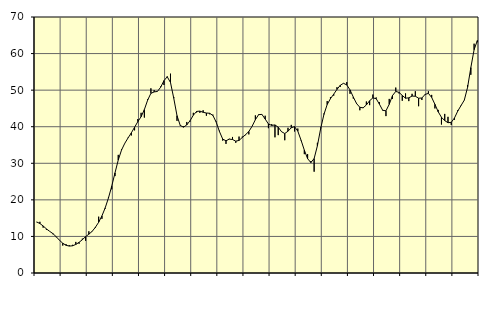
| Category | Piggar | Series 1 |
|---|---|---|
| nan | 13.9 | 13.96 |
| 87.0 | 14 | 13.53 |
| 87.0 | 12.4 | 12.86 |
| 87.0 | 11.8 | 12.06 |
| nan | 11.4 | 11.39 |
| 88.0 | 10.6 | 10.76 |
| 88.0 | 9.8 | 9.91 |
| 88.0 | 9 | 8.95 |
| nan | 7.5 | 8.14 |
| 89.0 | 7.9 | 7.58 |
| 89.0 | 7.6 | 7.36 |
| 89.0 | 7.7 | 7.44 |
| nan | 8.5 | 7.81 |
| 90.0 | 8 | 8.39 |
| 90.0 | 9.4 | 9.1 |
| 90.0 | 8.8 | 9.94 |
| nan | 11.4 | 10.61 |
| 91.0 | 11.3 | 11.38 |
| 91.0 | 12.3 | 12.5 |
| 91.0 | 15.4 | 13.87 |
| nan | 14.8 | 15.62 |
| 92.0 | 17.6 | 17.81 |
| 92.0 | 20.7 | 20.52 |
| 92.0 | 22.9 | 23.73 |
| nan | 26.5 | 27.37 |
| 93.0 | 32.3 | 30.9 |
| 93.0 | 33.8 | 33.6 |
| 93.0 | 35.5 | 35.46 |
| nan | 37 | 36.92 |
| 94.0 | 37.6 | 38.31 |
| 94.0 | 39 | 39.85 |
| 94.0 | 42.1 | 41.38 |
| nan | 43.8 | 42.73 |
| 95.0 | 42.5 | 44.69 |
| 95.0 | 47.5 | 47.26 |
| 95.0 | 50.5 | 49.13 |
| nan | 50 | 49.51 |
| 96.0 | 49.7 | 49.65 |
| 96.0 | 51 | 50.81 |
| 96.0 | 51.4 | 52.59 |
| nan | 53.8 | 53.65 |
| 97.0 | 54.5 | 52.09 |
| 97.0 | 48.1 | 47.79 |
| 97.0 | 41.6 | 43.02 |
| nan | 40.2 | 40.33 |
| 98.0 | 40.1 | 39.88 |
| 98.0 | 41.3 | 40.5 |
| 98.0 | 41.4 | 41.65 |
| nan | 43.8 | 43.15 |
| 99.0 | 43.9 | 44.18 |
| 99.0 | 43.8 | 44.27 |
| 99.0 | 44.5 | 43.94 |
| nan | 43 | 43.75 |
| 0.0 | 43.4 | 43.67 |
| 0.0 | 43.3 | 43.07 |
| 0.0 | 41.4 | 41.26 |
| nan | 38.9 | 38.68 |
| 1.0 | 36.2 | 36.61 |
| 1.0 | 35.3 | 36.15 |
| 1.0 | 36.7 | 36.61 |
| nan | 37.2 | 36.5 |
| 2.0 | 35.6 | 36.05 |
| 2.0 | 37.3 | 36.25 |
| 2.0 | 37.3 | 37.06 |
| nan | 37.7 | 37.83 |
| 3.0 | 37.9 | 38.69 |
| 3.0 | 40.1 | 40.12 |
| 3.0 | 43.1 | 41.92 |
| nan | 43.4 | 43.3 |
| 4.0 | 43.3 | 43.37 |
| 4.0 | 43 | 42.1 |
| 4.0 | 39.6 | 40.75 |
| nan | 40.7 | 40.36 |
| 5.0 | 37.1 | 40.49 |
| 5.0 | 37.7 | 39.87 |
| 5.0 | 38.7 | 38.64 |
| nan | 36.3 | 38.14 |
| 6.0 | 39.7 | 38.77 |
| 6.0 | 40.5 | 39.71 |
| 6.0 | 38.7 | 40.02 |
| nan | 39.5 | 38.79 |
| 7.0 | 36.2 | 36.3 |
| 7.0 | 32.5 | 33.59 |
| 7.0 | 32.5 | 31.27 |
| nan | 30.6 | 30.2 |
| 8.0 | 27.7 | 31.29 |
| 8.0 | 35.6 | 34.79 |
| 8.0 | 39.8 | 39.49 |
| nan | 43.6 | 43.36 |
| 9.0 | 47 | 46.08 |
| 9.0 | 48.1 | 47.67 |
| 9.0 | 48.5 | 48.91 |
| nan | 50.8 | 50.2 |
| 10.0 | 50.9 | 51.33 |
| 10.0 | 51.9 | 51.87 |
| 10.0 | 52.2 | 51.43 |
| nan | 49 | 50.06 |
| 11.0 | 47.7 | 48.12 |
| 11.0 | 46.5 | 46.33 |
| 11.0 | 44.5 | 45.31 |
| nan | 45.1 | 45.16 |
| 12.0 | 46.9 | 45.95 |
| 12.0 | 45.9 | 47.11 |
| 12.0 | 48.8 | 47.88 |
| nan | 48 | 47.66 |
| 13.0 | 46.7 | 46.16 |
| 13.0 | 44.4 | 44.49 |
| 13.0 | 42.9 | 44.35 |
| nan | 47.6 | 46.13 |
| 14.0 | 47.6 | 48.52 |
| 14.0 | 50.7 | 49.65 |
| 14.0 | 49.1 | 49.39 |
| nan | 47.1 | 48.55 |
| 15.0 | 49.1 | 47.79 |
| 15.0 | 47 | 47.9 |
| 15.0 | 49 | 48.38 |
| nan | 49.7 | 48.33 |
| 16.0 | 45.6 | 47.8 |
| 16.0 | 47.3 | 47.85 |
| 16.0 | 48.7 | 48.84 |
| nan | 49.7 | 49.11 |
| 17.0 | 48.7 | 48.01 |
| 17.0 | 45 | 46.12 |
| 17.0 | 44.6 | 44.08 |
| nan | 40.6 | 42.58 |
| 18.0 | 43.5 | 41.67 |
| 18.0 | 42.7 | 41.09 |
| 18.0 | 40.5 | 41.2 |
| nan | 41.9 | 42.41 |
| 19.0 | 44.5 | 44.28 |
| 19.0 | 45.7 | 45.79 |
| 19.0 | 47.3 | 47.27 |
| nan | 51.4 | 50.75 |
| 20.0 | 54.2 | 56.16 |
| 20.0 | 62.7 | 61.06 |
| 20.0 | 63.1 | 63.58 |